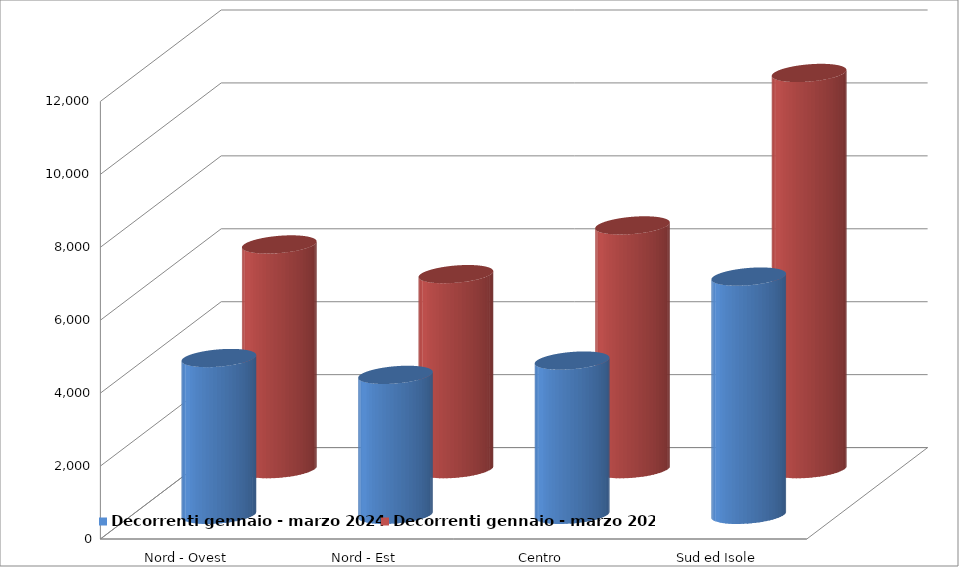
| Category | Decorrenti gennaio - marzo 2024 | Decorrenti gennaio - marzo 2023 |
|---|---|---|
| Nord - Ovest | 4301 | 6162 |
| Nord - Est | 3839 | 5348 |
| Centro | 4231 | 6684 |
| Sud ed Isole | 6534 | 10865 |